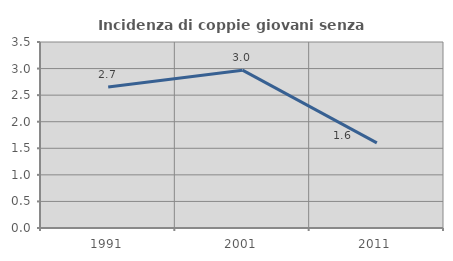
| Category | Incidenza di coppie giovani senza figli |
|---|---|
| 1991.0 | 2.652 |
| 2001.0 | 2.97 |
| 2011.0 | 1.602 |